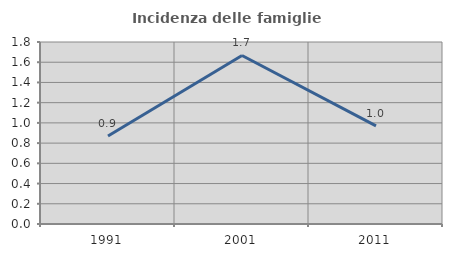
| Category | Incidenza delle famiglie numerose |
|---|---|
| 1991.0 | 0.87 |
| 2001.0 | 1.667 |
| 2011.0 | 0.971 |